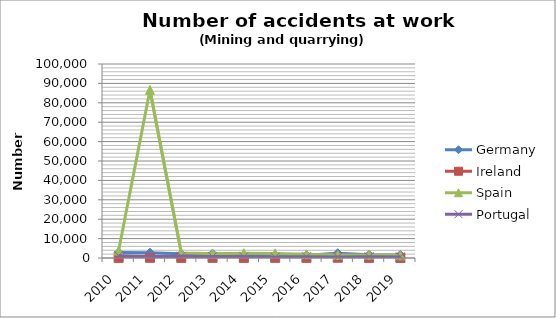
| Category | Germany | Ireland | Spain | Portugal |
|---|---|---|---|---|
| 2010 | 2799 | 65 | 3825 | 1179 |
| 2011 | 2734 | 108 | 86626 | 785 |
| 2012 | 2178 | 79 | 2711 | 892 |
| 2013 | 2248 | 90 | 2233 | 760 |
| 2014 | 1486 | 71 | 2462 | 728 |
| 2015 | 1407 | 99 | 2353 | 388 |
| 2016 | 1409 | 78 | 1939 | 666 |
| 2017 | 2477 | 139 | 1544 | 503 |
| 2018 | 1636 | 81 | 1604 | 602 |
| 2019 | 1598 | 34 | 1346 | 575 |